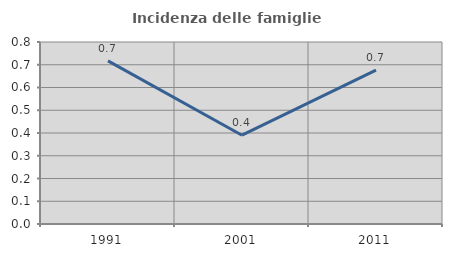
| Category | Incidenza delle famiglie numerose |
|---|---|
| 1991.0 | 0.717 |
| 2001.0 | 0.39 |
| 2011.0 | 0.676 |